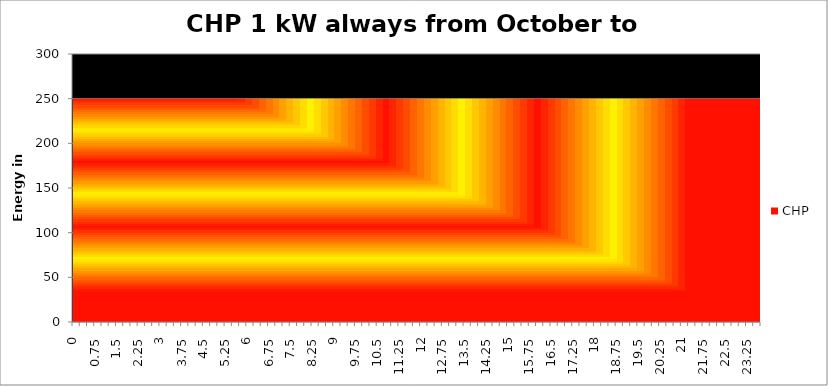
| Category | CHP |
|---|---|
| 0.0 | 250 |
| 0.25 | 250 |
| 0.5 | 250 |
| 0.75 | 250 |
| 1.0 | 250 |
| 1.25 | 250 |
| 1.5 | 250 |
| 1.75 | 250 |
| 2.0 | 250 |
| 2.25 | 250 |
| 2.5 | 250 |
| 2.75 | 250 |
| 3.0 | 250 |
| 3.25 | 250 |
| 3.5 | 250 |
| 3.75 | 250 |
| 4.0 | 250 |
| 4.25 | 250 |
| 4.5 | 250 |
| 4.75 | 250 |
| 5.0 | 250 |
| 5.25 | 250 |
| 5.5 | 250 |
| 5.75 | 250 |
| 6.0 | 250 |
| 6.25 | 250 |
| 6.5 | 250 |
| 6.75 | 250 |
| 7.0 | 250 |
| 7.25 | 250 |
| 7.5 | 250 |
| 7.75 | 250 |
| 8.0 | 250 |
| 8.25 | 250 |
| 8.5 | 250 |
| 8.75 | 250 |
| 9.0 | 250 |
| 9.25 | 250 |
| 9.5 | 250 |
| 9.75 | 250 |
| 10.0 | 250 |
| 10.25 | 250 |
| 10.5 | 250 |
| 10.75 | 250 |
| 11.0 | 250 |
| 11.25 | 250 |
| 11.5 | 250 |
| 11.75 | 250 |
| 12.0 | 250 |
| 12.25 | 250 |
| 12.5 | 250 |
| 12.75 | 250 |
| 13.0 | 250 |
| 13.25 | 250 |
| 13.5 | 250 |
| 13.75 | 250 |
| 14.0 | 250 |
| 14.25 | 250 |
| 14.5 | 250 |
| 14.75 | 250 |
| 15.0 | 250 |
| 15.25 | 250 |
| 15.5 | 250 |
| 15.75 | 250 |
| 16.0 | 250 |
| 16.25 | 250 |
| 16.5 | 250 |
| 16.75 | 250 |
| 17.0 | 250 |
| 17.25 | 250 |
| 17.5 | 250 |
| 17.75 | 250 |
| 18.0 | 250 |
| 18.25 | 250 |
| 18.5 | 250 |
| 18.75 | 250 |
| 19.0 | 250 |
| 19.25 | 250 |
| 19.5 | 250 |
| 19.75 | 250 |
| 20.0 | 250 |
| 20.25 | 250 |
| 20.5 | 250 |
| 20.75 | 250 |
| 21.0 | 250 |
| 21.25 | 250 |
| 21.5 | 250 |
| 21.75 | 250 |
| 22.0 | 250 |
| 22.25 | 250 |
| 22.5 | 250 |
| 22.75 | 250 |
| 23.0 | 250 |
| 23.25 | 250 |
| 23.5 | 250 |
| 23.75 | 250 |